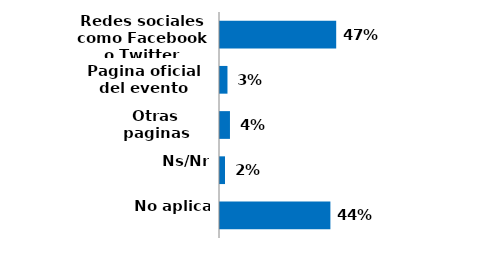
| Category | Series 0 |
|---|---|
| Redes sociales como Facebook o Twitter | 0.467 |
| Pagina oficial del evento | 0.03 |
| Otras paginas | 0.04 |
| Ns/Nr | 0.02 |
| No aplica | 0.443 |